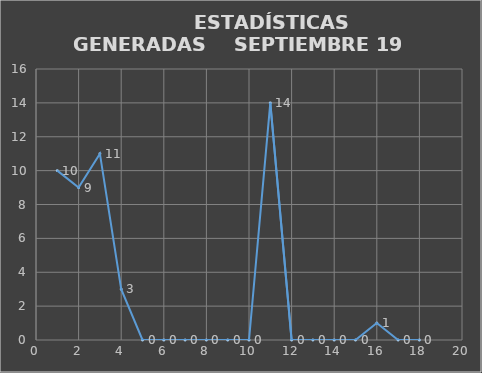
| Category |                   ESTADÍSTICAS GENERADAS  |
|---|---|
| 0 | 10 |
| 1 | 9 |
| 2 | 11 |
| 3 | 3 |
| 4 | 0 |
| 5 | 0 |
| 6 | 0 |
| 7 | 0 |
| 8 | 0 |
| 9 | 0 |
| 10 | 14 |
| 11 | 0 |
| 12 | 0 |
| 13 | 0 |
| 14 | 0 |
| 15 | 1 |
| 16 | 0 |
| 17 | 0 |